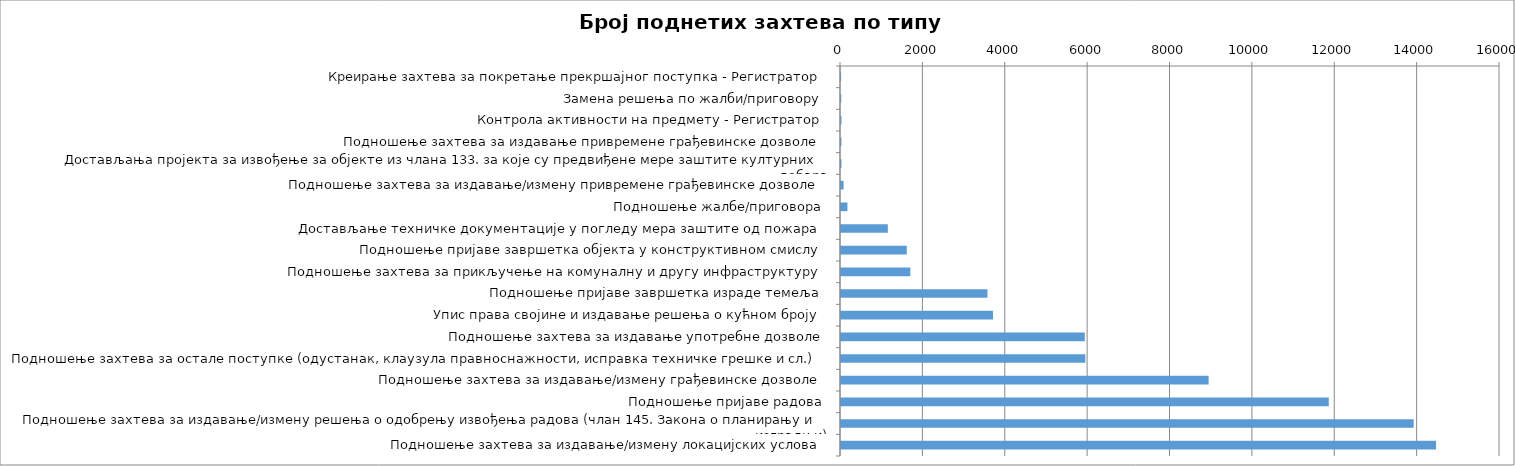
| Category | Број поднетих захтева |
|---|---|
| Креирање захтева за покретање прекршајног поступка - Регистратор | 3 |
| Замена решења по жалби/приговору | 7 |
| Контрола активности на предмету - Регистратор | 11 |
| Подношење захтева за издавање привремене грађевинске дозволе | 11 |
| Достављања пројекта за извођење за објекте из члана 133. за које су предвиђене мере заштите културних добара | 12 |
| Подношење захтева за издавање/измену привремене грађевинске дозволе | 63 |
| Подношење жалбе/приговора | 156 |
| Достављање техничке документације у погледу мера заштите од пожара | 1137 |
| Подношење пријаве завршетка објекта у конструктивном смислу | 1597 |
| Подношење захтева за прикључење на комуналну и другу инфраструктуру | 1683 |
| Подношење пријаве завршетка израде темеља | 3556 |
| Упис права својине и издавање решења о кућном броју | 3692 |
| Подношење захтева за издавање употребне дозволе | 5920 |
| Подношење захтева за остале поступке (одустанак, клаузула правноснажности, исправка техничке грешке и сл.) | 5933 |
| Подношење захтева за издавање/измену грађевинске дозволе | 8926 |
| Подношење пријаве радова | 11843 |
| Подношење захтева за издавање/измену решења о одобрењу извођења радова (члан 145. Закона о планирању и изградњи) | 13904 |
| Подношење захтева за издавање/измену локацијских услова | 14448 |